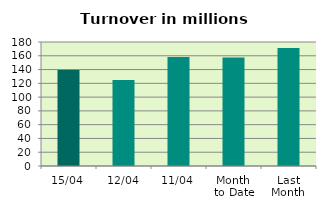
| Category | Series 0 |
|---|---|
| 15/04 | 139.443 |
| 12/04 | 124.914 |
| 11/04 | 158.252 |
| Month 
to Date | 157.432 |
| Last
Month | 171.15 |